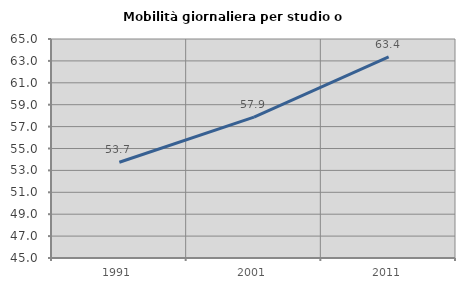
| Category | Mobilità giornaliera per studio o lavoro |
|---|---|
| 1991.0 | 53.745 |
| 2001.0 | 57.859 |
| 2011.0 | 63.375 |